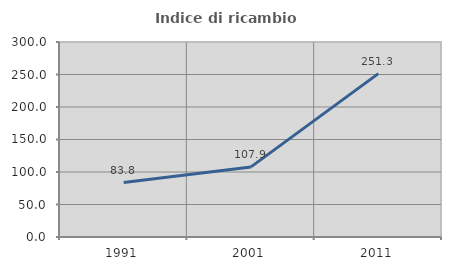
| Category | Indice di ricambio occupazionale  |
|---|---|
| 1991.0 | 83.799 |
| 2001.0 | 107.857 |
| 2011.0 | 251.327 |